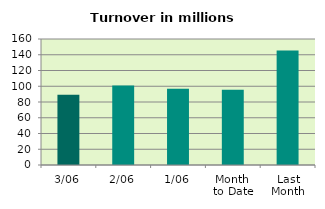
| Category | Series 0 |
|---|---|
| 3/06 | 89.183 |
| 2/06 | 100.826 |
| 1/06 | 96.898 |
| Month 
to Date | 95.636 |
| Last
Month | 145.388 |